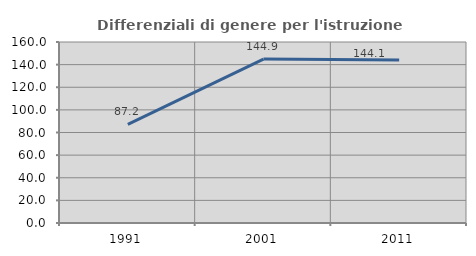
| Category | Differenziali di genere per l'istruzione superiore |
|---|---|
| 1991.0 | 87.203 |
| 2001.0 | 144.902 |
| 2011.0 | 144.088 |